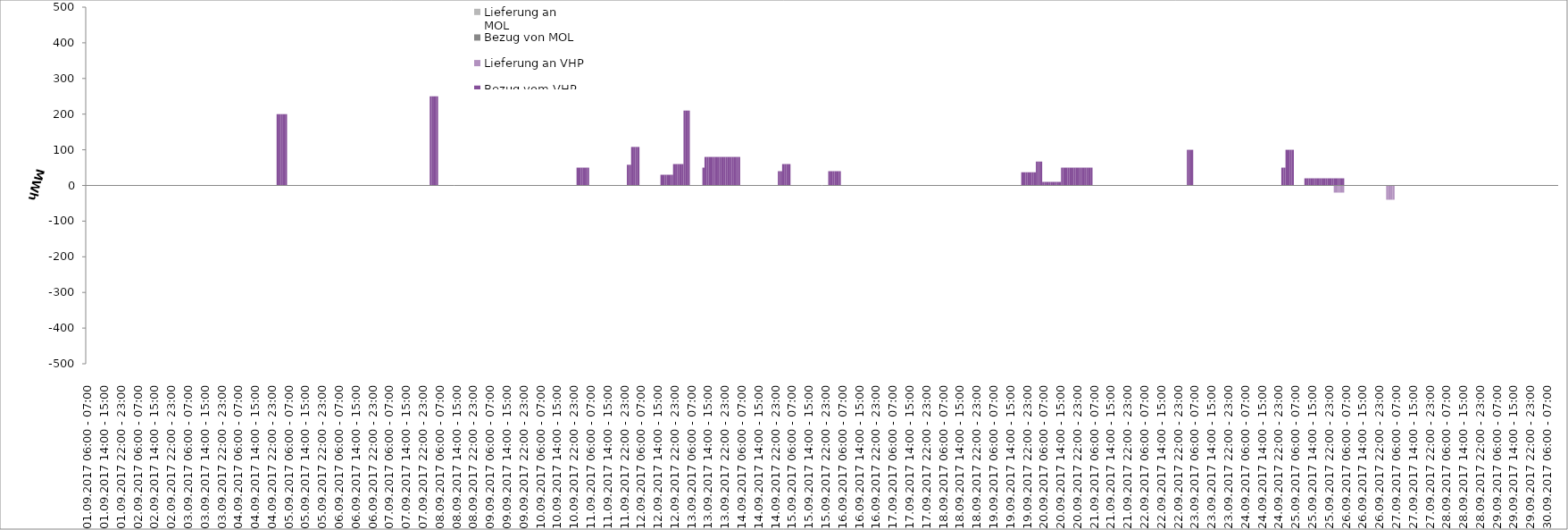
| Category | Bezug vom VHP | Lieferung an VHP | Bezug von MOL | Lieferung an MOL |
|---|---|---|---|---|
| 01.09.2017 06:00 - 07:00 | 0 | 0 | 0 | 0 |
| 01.09.2017 07:00 - 08:00 | 0 | 0 | 0 | 0 |
| 01.09.2017 08:00 - 09:00 | 0 | 0 | 0 | 0 |
| 01.09.2017 09:00 - 10:00 | 0 | 0 | 0 | 0 |
| 01.09.2017 10:00 - 11:00 | 0 | 0 | 0 | 0 |
| 01.09.2017 11:00 - 12:00 | 0 | 0 | 0 | 0 |
| 01.09.2017 12:00 - 13:00 | 0 | 0 | 0 | 0 |
| 01.09.2017 13:00 - 14:00 | 0 | 0 | 0 | 0 |
| 01.09.2017 14:00 - 15:00 | 0 | 0 | 0 | 0 |
| 01.09.2017 15:00 - 16:00 | 0 | 0 | 0 | 0 |
| 01.09.2017 16:00 - 17:00 | 0 | 0 | 0 | 0 |
| 01.09.2017 17:00 - 18:00 | 0 | 0 | 0 | 0 |
| 01.09.2017 18:00 - 19:00 | 0 | 0 | 0 | 0 |
| 01.09.2017 19:00 - 20:00 | 0 | 0 | 0 | 0 |
| 01.09.2017 20:00 - 21:00 | 0 | 0 | 0 | 0 |
| 01.09.2017 21:00 - 22:00 | 0 | 0 | 0 | 0 |
| 01.09.2017 22:00 - 23:00 | 0 | 0 | 0 | 0 |
| 01.09.2017 23:00 - 24:00 | 0 | 0 | 0 | 0 |
| 02.09.2017 00:00 - 01:00 | 0 | 0 | 0 | 0 |
| 02.09.2017 01:00 - 02:00 | 0 | 0 | 0 | 0 |
| 02.09.2017 02:00 - 03:00 | 0 | 0 | 0 | 0 |
| 02.09.2017 03:00 - 04:00 | 0 | 0 | 0 | 0 |
| 02.09.2017 04:00 - 05:00 | 0 | 0 | 0 | 0 |
| 02.09.2017 05:00 - 06:00 | 0 | 0 | 0 | 0 |
| 02.09.2017 06:00 - 07:00 | 0 | 0 | 0 | 0 |
| 02.09.2017 07:00 - 08:00 | 0 | 0 | 0 | 0 |
| 02.09.2017 08:00 - 09:00 | 0 | 0 | 0 | 0 |
| 02.09.2017 09:00 - 10:00 | 0 | 0 | 0 | 0 |
| 02.09.2017 10:00 - 11:00 | 0 | 0 | 0 | 0 |
| 02.09.2017 11:00 - 12:00 | 0 | 0 | 0 | 0 |
| 02.09.2017 12:00 - 13:00 | 0 | 0 | 0 | 0 |
| 02.09.2017 13:00 - 14:00 | 0 | 0 | 0 | 0 |
| 02.09.2017 14:00 - 15:00 | 0 | 0 | 0 | 0 |
| 02.09.2017 15:00 - 16:00 | 0 | 0 | 0 | 0 |
| 02.09.2017 16:00 - 17:00 | 0 | 0 | 0 | 0 |
| 02.09.2017 17:00 - 18:00 | 0 | 0 | 0 | 0 |
| 02.09.2017 18:00 - 19:00 | 0 | 0 | 0 | 0 |
| 02.09.2017 19:00 - 20:00 | 0 | 0 | 0 | 0 |
| 02.09.2017 20:00 - 21:00 | 0 | 0 | 0 | 0 |
| 02.09.2017 21:00 - 22:00 | 0 | 0 | 0 | 0 |
| 02.09.2017 22:00 - 23:00 | 0 | 0 | 0 | 0 |
| 02.09.2017 23:00 - 24:00 | 0 | 0 | 0 | 0 |
| 03.09.2017 00:00 - 01:00 | 0 | 0 | 0 | 0 |
| 03.09.2017 01:00 - 02:00 | 0 | 0 | 0 | 0 |
| 03.09.2017 02:00 - 03:00 | 0 | 0 | 0 | 0 |
| 03.09.2017 03:00 - 04:00 | 0 | 0 | 0 | 0 |
| 03.09.2017 04:00 - 05:00 | 0 | 0 | 0 | 0 |
| 03.09.2017 05:00 - 06:00 | 0 | 0 | 0 | 0 |
| 03.09.2017 06:00 - 07:00 | 0 | 0 | 0 | 0 |
| 03.09.2017 07:00 - 08:00 | 0 | 0 | 0 | 0 |
| 03.09.2017 08:00 - 09:00 | 0 | 0 | 0 | 0 |
| 03.09.2017 09:00 - 10:00 | 0 | 0 | 0 | 0 |
| 03.09.2017 10:00 - 11:00 | 0 | 0 | 0 | 0 |
| 03.09.2017 11:00 - 12:00 | 0 | 0 | 0 | 0 |
| 03.09.2017 12:00 - 13:00 | 0 | 0 | 0 | 0 |
| 03.09.2017 13:00 - 14:00 | 0 | 0 | 0 | 0 |
| 03.09.2017 14:00 - 15:00 | 0 | 0 | 0 | 0 |
| 03.09.2017 15:00 - 16:00 | 0 | 0 | 0 | 0 |
| 03.09.2017 16:00 - 17:00 | 0 | 0 | 0 | 0 |
| 03.09.2017 17:00 - 18:00 | 0 | 0 | 0 | 0 |
| 03.09.2017 18:00 - 19:00 | 0 | 0 | 0 | 0 |
| 03.09.2017 19:00 - 20:00 | 0 | 0 | 0 | 0 |
| 03.09.2017 20:00 - 21:00 | 0 | 0 | 0 | 0 |
| 03.09.2017 21:00 - 22:00 | 0 | 0 | 0 | 0 |
| 03.09.2017 22:00 - 23:00 | 0 | 0 | 0 | 0 |
| 03.09.2017 23:00 - 24:00 | 0 | 0 | 0 | 0 |
| 04.09.2017 00:00 - 01:00 | 0 | 0 | 0 | 0 |
| 04.09.2017 01:00 - 02:00 | 0 | 0 | 0 | 0 |
| 04.09.2017 02:00 - 03:00 | 0 | 0 | 0 | 0 |
| 04.09.2017 03:00 - 04:00 | 0 | 0 | 0 | 0 |
| 04.09.2017 04:00 - 05:00 | 0 | 0 | 0 | 0 |
| 04.09.2017 05:00 - 06:00 | 0 | 0 | 0 | 0 |
| 04.09.2017 06:00 - 07:00 | 0 | 0 | 0 | 0 |
| 04.09.2017 07:00 - 08:00 | 0 | 0 | 0 | 0 |
| 04.09.2017 08:00 - 09:00 | 0 | 0 | 0 | 0 |
| 04.09.2017 09:00 - 10:00 | 0 | 0 | 0 | 0 |
| 04.09.2017 10:00 - 11:00 | 0 | 0 | 0 | 0 |
| 04.09.2017 11:00 - 12:00 | 0 | 0 | 0 | 0 |
| 04.09.2017 12:00 - 13:00 | 0 | 0 | 0 | 0 |
| 04.09.2017 13:00 - 14:00 | 0 | 0 | 0 | 0 |
| 04.09.2017 14:00 - 15:00 | 0 | 0 | 0 | 0 |
| 04.09.2017 15:00 - 16:00 | 0 | 0 | 0 | 0 |
| 04.09.2017 16:00 - 17:00 | 0 | 0 | 0 | 0 |
| 04.09.2017 17:00 - 18:00 | 0 | 0 | 0 | 0 |
| 04.09.2017 18:00 - 19:00 | 0 | 0 | 0 | 0 |
| 04.09.2017 19:00 - 20:00 | 0 | 0 | 0 | 0 |
| 04.09.2017 20:00 - 21:00 | 0 | 0 | 0 | 0 |
| 04.09.2017 21:00 - 22:00 | 0 | 0 | 0 | 0 |
| 04.09.2017 22:00 - 23:00 | 0 | 0 | 0 | 0 |
| 04.09.2017 23:00 - 24:00 | 0 | 0 | 0 | 0 |
| 05.09.2017 00:00 - 01:00 | 0 | 0 | 0 | 0 |
| 05.09.2017 01:00 - 02:00 | 200 | 0 | 0 | 0 |
| 05.09.2017 02:00 - 03:00 | 200 | 0 | 0 | 0 |
| 05.09.2017 03:00 - 04:00 | 200 | 0 | 0 | 0 |
| 05.09.2017 04:00 - 05:00 | 200 | 0 | 0 | 0 |
| 05.09.2017 05:00 - 06:00 | 200 | 0 | 0 | 0 |
| 05.09.2017 06:00 - 07:00 | 0 | 0 | 0 | 0 |
| 05.09.2017 07:00 - 08:00 | 0 | 0 | 0 | 0 |
| 05.09.2017 08:00 - 09:00 | 0 | 0 | 0 | 0 |
| 05.09.2017 09:00 - 10:00 | 0 | 0 | 0 | 0 |
| 05.09.2017 10:00 - 11:00 | 0 | 0 | 0 | 0 |
| 05.09.2017 11:00 - 12:00 | 0 | 0 | 0 | 0 |
| 05.09.2017 12:00 - 13:00 | 0 | 0 | 0 | 0 |
| 05.09.2017 13:00 - 14:00 | 0 | 0 | 0 | 0 |
| 05.09.2017 14:00 - 15:00 | 0 | 0 | 0 | 0 |
| 05.09.2017 15:00 - 16:00 | 0 | 0 | 0 | 0 |
| 05.09.2017 16:00 - 17:00 | 0 | 0 | 0 | 0 |
| 05.09.2017 17:00 - 18:00 | 0 | 0 | 0 | 0 |
| 05.09.2017 18:00 - 19:00 | 0 | 0 | 0 | 0 |
| 05.09.2017 19:00 - 20:00 | 0 | 0 | 0 | 0 |
| 05.09.2017 20:00 - 21:00 | 0 | 0 | 0 | 0 |
| 05.09.2017 21:00 - 22:00 | 0 | 0 | 0 | 0 |
| 05.09.2017 22:00 - 23:00 | 0 | 0 | 0 | 0 |
| 05.09.2017 23:00 - 24:00 | 0 | 0 | 0 | 0 |
| 06.09.2017 00:00 - 01:00 | 0 | 0 | 0 | 0 |
| 06.09.2017 01:00 - 02:00 | 0 | 0 | 0 | 0 |
| 06.09.2017 02:00 - 03:00 | 0 | 0 | 0 | 0 |
| 06.09.2017 03:00 - 04:00 | 0 | 0 | 0 | 0 |
| 06.09.2017 04:00 - 05:00 | 0 | 0 | 0 | 0 |
| 06.09.2017 05:00 - 06:00 | 0 | 0 | 0 | 0 |
| 06.09.2017 06:00 - 07:00 | 0 | 0 | 0 | 0 |
| 06.09.2017 07:00 - 08:00 | 0 | 0 | 0 | 0 |
| 06.09.2017 08:00 - 09:00 | 0 | 0 | 0 | 0 |
| 06.09.2017 09:00 - 10:00 | 0 | 0 | 0 | 0 |
| 06.09.2017 10:00 - 11:00 | 0 | 0 | 0 | 0 |
| 06.09.2017 11:00 - 12:00 | 0 | 0 | 0 | 0 |
| 06.09.2017 12:00 - 13:00 | 0 | 0 | 0 | 0 |
| 06.09.2017 13:00 - 14:00 | 0 | 0 | 0 | 0 |
| 06.09.2017 14:00 - 15:00 | 0 | 0 | 0 | 0 |
| 06.09.2017 15:00 - 16:00 | 0 | 0 | 0 | 0 |
| 06.09.2017 16:00 - 17:00 | 0 | 0 | 0 | 0 |
| 06.09.2017 17:00 - 18:00 | 0 | 0 | 0 | 0 |
| 06.09.2017 18:00 - 19:00 | 0 | 0 | 0 | 0 |
| 06.09.2017 19:00 - 20:00 | 0 | 0 | 0 | 0 |
| 06.09.2017 20:00 - 21:00 | 0 | 0 | 0 | 0 |
| 06.09.2017 21:00 - 22:00 | 0 | 0 | 0 | 0 |
| 06.09.2017 22:00 - 23:00 | 0 | 0 | 0 | 0 |
| 06.09.2017 23:00 - 24:00 | 0 | 0 | 0 | 0 |
| 07.09.2017 00:00 - 01:00 | 0 | 0 | 0 | 0 |
| 07.09.2017 01:00 - 02:00 | 0 | 0 | 0 | 0 |
| 07.09.2017 02:00 - 03:00 | 0 | 0 | 0 | 0 |
| 07.09.2017 03:00 - 04:00 | 0 | 0 | 0 | 0 |
| 07.09.2017 04:00 - 05:00 | 0 | 0 | 0 | 0 |
| 07.09.2017 05:00 - 06:00 | 0 | 0 | 0 | 0 |
| 07.09.2017 06:00 - 07:00 | 0 | 0 | 0 | 0 |
| 07.09.2017 07:00 - 08:00 | 0 | 0 | 0 | 0 |
| 07.09.2017 08:00 - 09:00 | 0 | 0 | 0 | 0 |
| 07.09.2017 09:00 - 10:00 | 0 | 0 | 0 | 0 |
| 07.09.2017 10:00 - 11:00 | 0 | 0 | 0 | 0 |
| 07.09.2017 11:00 - 12:00 | 0 | 0 | 0 | 0 |
| 07.09.2017 12:00 - 13:00 | 0 | 0 | 0 | 0 |
| 07.09.2017 13:00 - 14:00 | 0 | 0 | 0 | 0 |
| 07.09.2017 14:00 - 15:00 | 0 | 0 | 0 | 0 |
| 07.09.2017 15:00 - 16:00 | 0 | 0 | 0 | 0 |
| 07.09.2017 16:00 - 17:00 | 0 | 0 | 0 | 0 |
| 07.09.2017 17:00 - 18:00 | 0 | 0 | 0 | 0 |
| 07.09.2017 18:00 - 19:00 | 0 | 0 | 0 | 0 |
| 07.09.2017 19:00 - 20:00 | 0 | 0 | 0 | 0 |
| 07.09.2017 20:00 - 21:00 | 0 | 0 | 0 | 0 |
| 07.09.2017 21:00 - 22:00 | 0 | 0 | 0 | 0 |
| 07.09.2017 22:00 - 23:00 | 0 | 0 | 0 | 0 |
| 07.09.2017 23:00 - 24:00 | 0 | 0 | 0 | 0 |
| 08.09.2017 00:00 - 01:00 | 0 | 0 | 0 | 0 |
| 08.09.2017 01:00 - 02:00 | 0 | 0 | 0 | 0 |
| 08.09.2017 02:00 - 03:00 | 250 | 0 | 0 | 0 |
| 08.09.2017 03:00 - 04:00 | 250 | 0 | 0 | 0 |
| 08.09.2017 04:00 - 05:00 | 250 | 0 | 0 | 0 |
| 08.09.2017 05:00 - 06:00 | 250 | 0 | 0 | 0 |
| 08.09.2017 06:00 - 07:00 | 0 | 0 | 0 | 0 |
| 08.09.2017 07:00 - 08:00 | 0 | 0 | 0 | 0 |
| 08.09.2017 08:00 - 09:00 | 0 | 0 | 0 | 0 |
| 08.09.2017 09:00 - 10:00 | 0 | 0 | 0 | 0 |
| 08.09.2017 10:00 - 11:00 | 0 | 0 | 0 | 0 |
| 08.09.2017 11:00 - 12:00 | 0 | 0 | 0 | 0 |
| 08.09.2017 12:00 - 13:00 | 0 | 0 | 0 | 0 |
| 08.09.2017 13:00 - 14:00 | 0 | 0 | 0 | 0 |
| 08.09.2017 14:00 - 15:00 | 0 | 0 | 0 | 0 |
| 08.09.2017 15:00 - 16:00 | 0 | 0 | 0 | 0 |
| 08.09.2017 16:00 - 17:00 | 0 | 0 | 0 | 0 |
| 08.09.2017 17:00 - 18:00 | 0 | 0 | 0 | 0 |
| 08.09.2017 18:00 - 19:00 | 0 | 0 | 0 | 0 |
| 08.09.2017 19:00 - 20:00 | 0 | 0 | 0 | 0 |
| 08.09.2017 20:00 - 21:00 | 0 | 0 | 0 | 0 |
| 08.09.2017 21:00 - 22:00 | 0 | 0 | 0 | 0 |
| 08.09.2017 22:00 - 23:00 | 0 | 0 | 0 | 0 |
| 08.09.2017 23:00 - 24:00 | 0 | 0 | 0 | 0 |
| 09.09.2017 00:00 - 01:00 | 0 | 0 | 0 | 0 |
| 09.09.2017 01:00 - 02:00 | 0 | 0 | 0 | 0 |
| 09.09.2017 02:00 - 03:00 | 0 | 0 | 0 | 0 |
| 09.09.2017 03:00 - 04:00 | 0 | 0 | 0 | 0 |
| 09.09.2017 04:00 - 05:00 | 0 | 0 | 0 | 0 |
| 09.09.2017 05:00 - 06:00 | 0 | 0 | 0 | 0 |
| 09.09.2017 06:00 - 07:00 | 0 | 0 | 0 | 0 |
| 09.09.2017 07:00 - 08:00 | 0 | 0 | 0 | 0 |
| 09.09.2017 08:00 - 09:00 | 0 | 0 | 0 | 0 |
| 09.09.2017 09:00 - 10:00 | 0 | 0 | 0 | 0 |
| 09.09.2017 10:00 - 11:00 | 0 | 0 | 0 | 0 |
| 09.09.2017 11:00 - 12:00 | 0 | 0 | 0 | 0 |
| 09.09.2017 12:00 - 13:00 | 0 | 0 | 0 | 0 |
| 09.09.2017 13:00 - 14:00 | 0 | 0 | 0 | 0 |
| 09.09.2017 14:00 - 15:00 | 0 | 0 | 0 | 0 |
| 09.09.2017 15:00 - 16:00 | 0 | 0 | 0 | 0 |
| 09.09.2017 16:00 - 17:00 | 0 | 0 | 0 | 0 |
| 09.09.2017 17:00 - 18:00 | 0 | 0 | 0 | 0 |
| 09.09.2017 18:00 - 19:00 | 0 | 0 | 0 | 0 |
| 09.09.2017 19:00 - 20:00 | 0 | 0 | 0 | 0 |
| 09.09.2017 20:00 - 21:00 | 0 | 0 | 0 | 0 |
| 09.09.2017 21:00 - 22:00 | 0 | 0 | 0 | 0 |
| 09.09.2017 22:00 - 23:00 | 0 | 0 | 0 | 0 |
| 09.09.2017 23:00 - 24:00 | 0 | 0 | 0 | 0 |
| 10.09.2017 00:00 - 01:00 | 0 | 0 | 0 | 0 |
| 10.09.2017 01:00 - 02:00 | 0 | 0 | 0 | 0 |
| 10.09.2017 02:00 - 03:00 | 0 | 0 | 0 | 0 |
| 10.09.2017 03:00 - 04:00 | 0 | 0 | 0 | 0 |
| 10.09.2017 04:00 - 05:00 | 0 | 0 | 0 | 0 |
| 10.09.2017 05:00 - 06:00 | 0 | 0 | 0 | 0 |
| 10.09.2017 06:00 - 07:00 | 0 | 0 | 0 | 0 |
| 10.09.2017 07:00 - 08:00 | 0 | 0 | 0 | 0 |
| 10.09.2017 08:00 - 09:00 | 0 | 0 | 0 | 0 |
| 10.09.2017 09:00 - 10:00 | 0 | 0 | 0 | 0 |
| 10.09.2017 10:00 - 11:00 | 0 | 0 | 0 | 0 |
| 10.09.2017 11:00 - 12:00 | 0 | 0 | 0 | 0 |
| 10.09.2017 12:00 - 13:00 | 0 | 0 | 0 | 0 |
| 10.09.2017 13:00 - 14:00 | 0 | 0 | 0 | 0 |
| 10.09.2017 14:00 - 15:00 | 0 | 0 | 0 | 0 |
| 10.09.2017 15:00 - 16:00 | 0 | 0 | 0 | 0 |
| 10.09.2017 16:00 - 17:00 | 0 | 0 | 0 | 0 |
| 10.09.2017 17:00 - 18:00 | 0 | 0 | 0 | 0 |
| 10.09.2017 18:00 - 19:00 | 0 | 0 | 0 | 0 |
| 10.09.2017 19:00 - 20:00 | 0 | 0 | 0 | 0 |
| 10.09.2017 20:00 - 21:00 | 0 | 0 | 0 | 0 |
| 10.09.2017 21:00 - 22:00 | 0 | 0 | 0 | 0 |
| 10.09.2017 22:00 - 23:00 | 0 | 0 | 0 | 0 |
| 10.09.2017 23:00 - 24:00 | 0 | 0 | 0 | 0 |
| 11.09.2017 00:00 - 01:00 | 50 | 0 | 0 | 0 |
| 11.09.2017 01:00 - 02:00 | 50 | 0 | 0 | 0 |
| 11.09.2017 02:00 - 03:00 | 50 | 0 | 0 | 0 |
| 11.09.2017 03:00 - 04:00 | 50 | 0 | 0 | 0 |
| 11.09.2017 04:00 - 05:00 | 50 | 0 | 0 | 0 |
| 11.09.2017 05:00 - 06:00 | 50 | 0 | 0 | 0 |
| 11.09.2017 06:00 - 07:00 | 0 | 0 | 0 | 0 |
| 11.09.2017 07:00 - 08:00 | 0 | 0 | 0 | 0 |
| 11.09.2017 08:00 - 09:00 | 0 | 0 | 0 | 0 |
| 11.09.2017 09:00 - 10:00 | 0 | 0 | 0 | 0 |
| 11.09.2017 10:00 - 11:00 | 0 | 0 | 0 | 0 |
| 11.09.2017 11:00 - 12:00 | 0 | 0 | 0 | 0 |
| 11.09.2017 12:00 - 13:00 | 0 | 0 | 0 | 0 |
| 11.09.2017 13:00 - 14:00 | 0 | 0 | 0 | 0 |
| 11.09.2017 14:00 - 15:00 | 0 | 0 | 0 | 0 |
| 11.09.2017 15:00 - 16:00 | 0 | 0 | 0 | 0 |
| 11.09.2017 16:00 - 17:00 | 0 | 0 | 0 | 0 |
| 11.09.2017 17:00 - 18:00 | 0 | 0 | 0 | 0 |
| 11.09.2017 18:00 - 19:00 | 0 | 0 | 0 | 0 |
| 11.09.2017 19:00 - 20:00 | 0 | 0 | 0 | 0 |
| 11.09.2017 20:00 - 21:00 | 0 | 0 | 0 | 0 |
| 11.09.2017 21:00 - 22:00 | 0 | 0 | 0 | 0 |
| 11.09.2017 22:00 - 23:00 | 0 | 0 | 0 | 0 |
| 11.09.2017 23:00 - 24:00 | 0 | 0 | 0 | 0 |
| 12.09.2017 00:00 - 01:00 | 58 | 0 | 0 | 0 |
| 12.09.2017 01:00 - 02:00 | 58 | 0 | 0 | 0 |
| 12.09.2017 02:00 - 03:00 | 108 | 0 | 0 | 0 |
| 12.09.2017 03:00 - 04:00 | 108 | 0 | 0 | 0 |
| 12.09.2017 04:00 - 05:00 | 108 | 0 | 0 | 0 |
| 12.09.2017 05:00 - 06:00 | 108 | 0 | 0 | 0 |
| 12.09.2017 06:00 - 07:00 | 0 | 0 | 0 | 0 |
| 12.09.2017 07:00 - 08:00 | 0 | 0 | 0 | 0 |
| 12.09.2017 08:00 - 09:00 | 0 | 0 | 0 | 0 |
| 12.09.2017 09:00 - 10:00 | 0 | 0 | 0 | 0 |
| 12.09.2017 10:00 - 11:00 | 0 | 0 | 0 | 0 |
| 12.09.2017 11:00 - 12:00 | 0 | 0 | 0 | 0 |
| 12.09.2017 12:00 - 13:00 | 0 | 0 | 0 | 0 |
| 12.09.2017 13:00 - 14:00 | 0 | 0 | 0 | 0 |
| 12.09.2017 14:00 - 15:00 | 0 | 0 | 0 | 0 |
| 12.09.2017 15:00 - 16:00 | 0 | 0 | 0 | 0 |
| 12.09.2017 16:00 - 17:00 | 30 | 0 | 0 | 0 |
| 12.09.2017 17:00 - 18:00 | 30 | 0 | 0 | 0 |
| 12.09.2017 18:00 - 19:00 | 30 | 0 | 0 | 0 |
| 12.09.2017 19:00 - 20:00 | 30 | 0 | 0 | 0 |
| 12.09.2017 20:00 - 21:00 | 30 | 0 | 0 | 0 |
| 12.09.2017 21:00 - 22:00 | 30 | 0 | 0 | 0 |
| 12.09.2017 22:00 - 23:00 | 60 | 0 | 0 | 0 |
| 12.09.2017 23:00 - 24:00 | 60 | 0 | 0 | 0 |
| 13.09.2017 00:00 - 01:00 | 60 | 0 | 0 | 0 |
| 13.09.2017 01:00 - 02:00 | 60 | 0 | 0 | 0 |
| 13.09.2017 02:00 - 03:00 | 60 | 0 | 0 | 0 |
| 13.09.2017 03:00 - 04:00 | 210 | 0 | 0 | 0 |
| 13.09.2017 04:00 - 05:00 | 210 | 0 | 0 | 0 |
| 13.09.2017 05:00 - 06:00 | 210 | 0 | 0 | 0 |
| 13.09.2017 06:00 - 07:00 | 0 | 0 | 0 | 0 |
| 13.09.2017 07:00 - 08:00 | 0 | 0 | 0 | 0 |
| 13.09.2017 08:00 - 09:00 | 0 | 0 | 0 | 0 |
| 13.09.2017 09:00 - 10:00 | 0 | 0 | 0 | 0 |
| 13.09.2017 10:00 - 11:00 | 0 | 0 | 0 | 0 |
| 13.09.2017 11:00 - 12:00 | 0 | 0 | 0 | 0 |
| 13.09.2017 12:00 - 13:00 | 50 | 0 | 0 | 0 |
| 13.09.2017 13:00 - 14:00 | 80 | 0 | 0 | 0 |
| 13.09.2017 14:00 - 15:00 | 80 | 0 | 0 | 0 |
| 13.09.2017 15:00 - 16:00 | 80 | 0 | 0 | 0 |
| 13.09.2017 16:00 - 17:00 | 80 | 0 | 0 | 0 |
| 13.09.2017 17:00 - 18:00 | 80 | 0 | 0 | 0 |
| 13.09.2017 18:00 - 19:00 | 80 | 0 | 0 | 0 |
| 13.09.2017 19:00 - 20:00 | 80 | 0 | 0 | 0 |
| 13.09.2017 20:00 - 21:00 | 80 | 0 | 0 | 0 |
| 13.09.2017 21:00 - 22:00 | 80 | 0 | 0 | 0 |
| 13.09.2017 22:00 - 23:00 | 80 | 0 | 0 | 0 |
| 13.09.2017 23:00 - 24:00 | 80 | 0 | 0 | 0 |
| 14.09.2017 00:00 - 01:00 | 80 | 0 | 0 | 0 |
| 14.09.2017 01:00 - 02:00 | 80 | 0 | 0 | 0 |
| 14.09.2017 02:00 - 03:00 | 80 | 0 | 0 | 0 |
| 14.09.2017 03:00 - 04:00 | 80 | 0 | 0 | 0 |
| 14.09.2017 04:00 - 05:00 | 80 | 0 | 0 | 0 |
| 14.09.2017 05:00 - 06:00 | 80 | 0 | 0 | 0 |
| 14.09.2017 06:00 - 07:00 | 0 | 0 | 0 | 0 |
| 14.09.2017 07:00 - 08:00 | 0 | 0 | 0 | 0 |
| 14.09.2017 08:00 - 09:00 | 0 | 0 | 0 | 0 |
| 14.09.2017 09:00 - 10:00 | 0 | 0 | 0 | 0 |
| 14.09.2017 10:00 - 11:00 | 0 | 0 | 0 | 0 |
| 14.09.2017 11:00 - 12:00 | 0 | 0 | 0 | 0 |
| 14.09.2017 12:00 - 13:00 | 0 | 0 | 0 | 0 |
| 14.09.2017 13:00 - 14:00 | 0 | 0 | 0 | 0 |
| 14.09.2017 14:00 - 15:00 | 0 | 0 | 0 | 0 |
| 14.09.2017 15:00 - 16:00 | 0 | 0 | 0 | 0 |
| 14.09.2017 16:00 - 17:00 | 0 | 0 | 0 | 0 |
| 14.09.2017 17:00 - 18:00 | 0 | 0 | 0 | 0 |
| 14.09.2017 18:00 - 19:00 | 0 | 0 | 0 | 0 |
| 14.09.2017 19:00 - 20:00 | 0 | 0 | 0 | 0 |
| 14.09.2017 20:00 - 21:00 | 0 | 0 | 0 | 0 |
| 14.09.2017 21:00 - 22:00 | 0 | 0 | 0 | 0 |
| 14.09.2017 22:00 - 23:00 | 0 | 0 | 0 | 0 |
| 14.09.2017 23:00 - 24:00 | 0 | 0 | 0 | 0 |
| 15.09.2017 00:00 - 01:00 | 40 | 0 | 0 | 0 |
| 15.09.2017 01:00 - 02:00 | 40 | 0 | 0 | 0 |
| 15.09.2017 02:00 - 03:00 | 60 | 0 | 0 | 0 |
| 15.09.2017 03:00 - 04:00 | 60 | 0 | 0 | 0 |
| 15.09.2017 04:00 - 05:00 | 60 | 0 | 0 | 0 |
| 15.09.2017 05:00 - 06:00 | 60 | 0 | 0 | 0 |
| 15.09.2017 06:00 - 07:00 | 0 | 0 | 0 | 0 |
| 15.09.2017 07:00 - 08:00 | 0 | 0 | 0 | 0 |
| 15.09.2017 08:00 - 09:00 | 0 | 0 | 0 | 0 |
| 15.09.2017 09:00 - 10:00 | 0 | 0 | 0 | 0 |
| 15.09.2017 10:00 - 11:00 | 0 | 0 | 0 | 0 |
| 15.09.2017 11:00 - 12:00 | 0 | 0 | 0 | 0 |
| 15.09.2017 12:00 - 13:00 | 0 | 0 | 0 | 0 |
| 15.09.2017 13:00 - 14:00 | 0 | 0 | 0 | 0 |
| 15.09.2017 14:00 - 15:00 | 0 | 0 | 0 | 0 |
| 15.09.2017 15:00 - 16:00 | 0 | 0 | 0 | 0 |
| 15.09.2017 16:00 - 17:00 | 0 | 0 | 0 | 0 |
| 15.09.2017 17:00 - 18:00 | 0 | 0 | 0 | 0 |
| 15.09.2017 18:00 - 19:00 | 0 | 0 | 0 | 0 |
| 15.09.2017 19:00 - 20:00 | 0 | 0 | 0 | 0 |
| 15.09.2017 20:00 - 21:00 | 0 | 0 | 0 | 0 |
| 15.09.2017 21:00 - 22:00 | 0 | 0 | 0 | 0 |
| 15.09.2017 22:00 - 23:00 | 0 | 0 | 0 | 0 |
| 15.09.2017 23:00 - 24:00 | 0 | 0 | 0 | 0 |
| 16.09.2017 00:00 - 01:00 | 40 | 0 | 0 | 0 |
| 16.09.2017 01:00 - 02:00 | 40 | 0 | 0 | 0 |
| 16.09.2017 02:00 - 03:00 | 40 | 0 | 0 | 0 |
| 16.09.2017 03:00 - 04:00 | 40 | 0 | 0 | 0 |
| 16.09.2017 04:00 - 05:00 | 40 | 0 | 0 | 0 |
| 16.09.2017 05:00 - 06:00 | 40 | 0 | 0 | 0 |
| 16.09.2017 06:00 - 07:00 | 0 | 0 | 0 | 0 |
| 16.09.2017 07:00 - 08:00 | 0 | 0 | 0 | 0 |
| 16.09.2017 08:00 - 09:00 | 0 | 0 | 0 | 0 |
| 16.09.2017 09:00 - 10:00 | 0 | 0 | 0 | 0 |
| 16.09.2017 10:00 - 11:00 | 0 | 0 | 0 | 0 |
| 16.09.2017 11:00 - 12:00 | 0 | 0 | 0 | 0 |
| 16.09.2017 12:00 - 13:00 | 0 | 0 | 0 | 0 |
| 16.09.2017 13:00 - 14:00 | 0 | 0 | 0 | 0 |
| 16.09.2017 14:00 - 15:00 | 0 | 0 | 0 | 0 |
| 16.09.2017 15:00 - 16:00 | 0 | 0 | 0 | 0 |
| 16.09.2017 16:00 - 17:00 | 0 | 0 | 0 | 0 |
| 16.09.2017 17:00 - 18:00 | 0 | 0 | 0 | 0 |
| 16.09.2017 18:00 - 19:00 | 0 | 0 | 0 | 0 |
| 16.09.2017 19:00 - 20:00 | 0 | 0 | 0 | 0 |
| 16.09.2017 20:00 - 21:00 | 0 | 0 | 0 | 0 |
| 16.09.2017 21:00 - 22:00 | 0 | 0 | 0 | 0 |
| 16.09.2017 22:00 - 23:00 | 0 | 0 | 0 | 0 |
| 16.09.2017 23:00 - 24:00 | 0 | 0 | 0 | 0 |
| 17.09.2017 00:00 - 01:00 | 0 | 0 | 0 | 0 |
| 17.09.2017 01:00 - 02:00 | 0 | 0 | 0 | 0 |
| 17.09.2017 02:00 - 03:00 | 0 | 0 | 0 | 0 |
| 17.09.2017 03:00 - 04:00 | 0 | 0 | 0 | 0 |
| 17.09.2017 04:00 - 05:00 | 0 | 0 | 0 | 0 |
| 17.09.2017 05:00 - 06:00 | 0 | 0 | 0 | 0 |
| 17.09.2017 06:00 - 07:00 | 0 | 0 | 0 | 0 |
| 17.09.2017 07:00 - 08:00 | 0 | 0 | 0 | 0 |
| 17.09.2017 08:00 - 09:00 | 0 | 0 | 0 | 0 |
| 17.09.2017 09:00 - 10:00 | 0 | 0 | 0 | 0 |
| 17.09.2017 10:00 - 11:00 | 0 | 0 | 0 | 0 |
| 17.09.2017 11:00 - 12:00 | 0 | 0 | 0 | 0 |
| 17.09.2017 12:00 - 13:00 | 0 | 0 | 0 | 0 |
| 17.09.2017 13:00 - 14:00 | 0 | 0 | 0 | 0 |
| 17.09.2017 14:00 - 15:00 | 0 | 0 | 0 | 0 |
| 17.09.2017 15:00 - 16:00 | 0 | 0 | 0 | 0 |
| 17.09.2017 16:00 - 17:00 | 0 | 0 | 0 | 0 |
| 17.09.2017 17:00 - 18:00 | 0 | 0 | 0 | 0 |
| 17.09.2017 18:00 - 19:00 | 0 | 0 | 0 | 0 |
| 17.09.2017 19:00 - 20:00 | 0 | 0 | 0 | 0 |
| 17.09.2017 20:00 - 21:00 | 0 | 0 | 0 | 0 |
| 17.09.2017 21:00 - 22:00 | 0 | 0 | 0 | 0 |
| 17.09.2017 22:00 - 23:00 | 0 | 0 | 0 | 0 |
| 17.09.2017 23:00 - 24:00 | 0 | 0 | 0 | 0 |
| 18.09.2017 00:00 - 01:00 | 0 | 0 | 0 | 0 |
| 18.09.2017 01:00 - 02:00 | 0 | 0 | 0 | 0 |
| 18.09.2017 02:00 - 03:00 | 0 | 0 | 0 | 0 |
| 18.09.2017 03:00 - 04:00 | 0 | 0 | 0 | 0 |
| 18.09.2017 04:00 - 05:00 | 0 | 0 | 0 | 0 |
| 18.09.2017 05:00 - 06:00 | 0 | 0 | 0 | 0 |
| 18.09.2017 06:00 - 07:00 | 0 | 0 | 0 | 0 |
| 18.09.2017 07:00 - 08:00 | 0 | 0 | 0 | 0 |
| 18.09.2017 08:00 - 09:00 | 0 | 0 | 0 | 0 |
| 18.09.2017 09:00 - 10:00 | 0 | 0 | 0 | 0 |
| 18.09.2017 10:00 - 11:00 | 0 | 0 | 0 | 0 |
| 18.09.2017 11:00 - 12:00 | 0 | 0 | 0 | 0 |
| 18.09.2017 12:00 - 13:00 | 0 | 0 | 0 | 0 |
| 18.09.2017 13:00 - 14:00 | 0 | 0 | 0 | 0 |
| 18.09.2017 14:00 - 15:00 | 0 | 0 | 0 | 0 |
| 18.09.2017 15:00 - 16:00 | 0 | 0 | 0 | 0 |
| 18.09.2017 16:00 - 17:00 | 0 | 0 | 0 | 0 |
| 18.09.2017 17:00 - 18:00 | 0 | 0 | 0 | 0 |
| 18.09.2017 18:00 - 19:00 | 0 | 0 | 0 | 0 |
| 18.09.2017 19:00 - 20:00 | 0 | 0 | 0 | 0 |
| 18.09.2017 20:00 - 21:00 | 0 | 0 | 0 | 0 |
| 18.09.2017 21:00 - 22:00 | 0 | 0 | 0 | 0 |
| 18.09.2017 22:00 - 23:00 | 0 | 0 | 0 | 0 |
| 18.09.2017 23:00 - 24:00 | 0 | 0 | 0 | 0 |
| 19.09.2017 00:00 - 01:00 | 0 | 0 | 0 | 0 |
| 19.09.2017 01:00 - 02:00 | 0 | 0 | 0 | 0 |
| 19.09.2017 02:00 - 03:00 | 0 | 0 | 0 | 0 |
| 19.09.2017 03:00 - 04:00 | 0 | 0 | 0 | 0 |
| 19.09.2017 04:00 - 05:00 | 0 | 0 | 0 | 0 |
| 19.09.2017 05:00 - 06:00 | 0 | 0 | 0 | 0 |
| 19.09.2017 06:00 - 07:00 | 0 | 0 | 0 | 0 |
| 19.09.2017 07:00 - 08:00 | 0 | 0 | 0 | 0 |
| 19.09.2017 08:00 - 09:00 | 0 | 0 | 0 | 0 |
| 19.09.2017 09:00 - 10:00 | 0 | 0 | 0 | 0 |
| 19.09.2017 10:00 - 11:00 | 0 | 0 | 0 | 0 |
| 19.09.2017 11:00 - 12:00 | 0 | 0 | 0 | 0 |
| 19.09.2017 12:00 - 13:00 | 0 | 0 | 0 | 0 |
| 19.09.2017 13:00 - 14:00 | 0 | 0 | 0 | 0 |
| 19.09.2017 14:00 - 15:00 | 0 | 0 | 0 | 0 |
| 19.09.2017 15:00 - 16:00 | 0 | 0 | 0 | 0 |
| 19.09.2017 16:00 - 17:00 | 0 | 0 | 0 | 0 |
| 19.09.2017 17:00 - 18:00 | 0 | 0 | 0 | 0 |
| 19.09.2017 18:00 - 19:00 | 0 | 0 | 0 | 0 |
| 19.09.2017 19:00 - 20:00 | 0 | 0 | 0 | 0 |
| 19.09.2017 20:00 - 21:00 | 37 | 0 | 0 | 0 |
| 19.09.2017 21:00 - 22:00 | 37 | 0 | 0 | 0 |
| 19.09.2017 22:00 - 23:00 | 37 | 0 | 0 | 0 |
| 19.09.2017 23:00 - 24:00 | 37 | 0 | 0 | 0 |
| 20.09.2017 00:00 - 01:00 | 37 | 0 | 0 | 0 |
| 20.09.2017 01:00 - 02:00 | 37 | 0 | 0 | 0 |
| 20.09.2017 02:00 - 03:00 | 37 | 0 | 0 | 0 |
| 20.09.2017 03:00 - 04:00 | 67 | 0 | 0 | 0 |
| 20.09.2017 04:00 - 05:00 | 67 | 0 | 0 | 0 |
| 20.09.2017 05:00 - 06:00 | 67 | 0 | 0 | 0 |
| 20.09.2017 06:00 - 07:00 | 10 | 0 | 0 | 0 |
| 20.09.2017 07:00 - 08:00 | 10 | 0 | 0 | 0 |
| 20.09.2017 08:00 - 09:00 | 10 | 0 | 0 | 0 |
| 20.09.2017 09:00 - 10:00 | 10 | 0 | 0 | 0 |
| 20.09.2017 10:00 - 11:00 | 10 | 0 | 0 | 0 |
| 20.09.2017 11:00 - 12:00 | 10 | 0 | 0 | 0 |
| 20.09.2017 12:00 - 13:00 | 10 | 0 | 0 | 0 |
| 20.09.2017 13:00 - 14:00 | 10 | 0 | 0 | 0 |
| 20.09.2017 14:00 - 15:00 | 10 | 0 | 0 | 0 |
| 20.09.2017 15:00 - 16:00 | 50 | 0 | 0 | 0 |
| 20.09.2017 16:00 - 17:00 | 50 | 0 | 0 | 0 |
| 20.09.2017 17:00 - 18:00 | 50 | 0 | 0 | 0 |
| 20.09.2017 18:00 - 19:00 | 50 | 0 | 0 | 0 |
| 20.09.2017 19:00 - 20:00 | 50 | 0 | 0 | 0 |
| 20.09.2017 20:00 - 21:00 | 50 | 0 | 0 | 0 |
| 20.09.2017 21:00 - 22:00 | 50 | 0 | 0 | 0 |
| 20.09.2017 22:00 - 23:00 | 50 | 0 | 0 | 0 |
| 20.09.2017 23:00 - 24:00 | 50 | 0 | 0 | 0 |
| 21.09.2017 00:00 - 01:00 | 50 | 0 | 0 | 0 |
| 21.09.2017 01:00 - 02:00 | 50 | 0 | 0 | 0 |
| 21.09.2017 02:00 - 03:00 | 50 | 0 | 0 | 0 |
| 21.09.2017 03:00 - 04:00 | 50 | 0 | 0 | 0 |
| 21.09.2017 04:00 - 05:00 | 50 | 0 | 0 | 0 |
| 21.09.2017 05:00 - 06:00 | 50 | 0 | 0 | 0 |
| 21.09.2017 06:00 - 07:00 | 0 | 0 | 0 | 0 |
| 21.09.2017 07:00 - 08:00 | 0 | 0 | 0 | 0 |
| 21.09.2017 08:00 - 09:00 | 0 | 0 | 0 | 0 |
| 21.09.2017 09:00 - 10:00 | 0 | 0 | 0 | 0 |
| 21.09.2017 10:00 - 11:00 | 0 | 0 | 0 | 0 |
| 21.09.2017 11:00 - 12:00 | 0 | 0 | 0 | 0 |
| 21.09.2017 12:00 - 13:00 | 0 | 0 | 0 | 0 |
| 21.09.2017 13:00 - 14:00 | 0 | 0 | 0 | 0 |
| 21.09.2017 14:00 - 15:00 | 0 | 0 | 0 | 0 |
| 21.09.2017 15:00 - 16:00 | 0 | 0 | 0 | 0 |
| 21.09.2017 16:00 - 17:00 | 0 | 0 | 0 | 0 |
| 21.09.2017 17:00 - 18:00 | 0 | 0 | 0 | 0 |
| 21.09.2017 18:00 - 19:00 | 0 | 0 | 0 | 0 |
| 21.09.2017 19:00 - 20:00 | 0 | 0 | 0 | 0 |
| 21.09.2017 20:00 - 21:00 | 0 | 0 | 0 | 0 |
| 21.09.2017 21:00 - 22:00 | 0 | 0 | 0 | 0 |
| 21.09.2017 22:00 - 23:00 | 0 | 0 | 0 | 0 |
| 21.09.2017 23:00 - 24:00 | 0 | 0 | 0 | 0 |
| 22.09.2017 00:00 - 01:00 | 0 | 0 | 0 | 0 |
| 22.09.2017 01:00 - 02:00 | 0 | 0 | 0 | 0 |
| 22.09.2017 02:00 - 03:00 | 0 | 0 | 0 | 0 |
| 22.09.2017 03:00 - 04:00 | 0 | 0 | 0 | 0 |
| 22.09.2017 04:00 - 05:00 | 0 | 0 | 0 | 0 |
| 22.09.2017 05:00 - 06:00 | 0 | 0 | 0 | 0 |
| 22.09.2017 06:00 - 07:00 | 0 | 0 | 0 | 0 |
| 22.09.2017 07:00 - 08:00 | 0 | 0 | 0 | 0 |
| 22.09.2017 08:00 - 09:00 | 0 | 0 | 0 | 0 |
| 22.09.2017 09:00 - 10:00 | 0 | 0 | 0 | 0 |
| 22.09.2017 10:00 - 11:00 | 0 | 0 | 0 | 0 |
| 22.09.2017 11:00 - 12:00 | 0 | 0 | 0 | 0 |
| 22.09.2017 12:00 - 13:00 | 0 | 0 | 0 | 0 |
| 22.09.2017 13:00 - 14:00 | 0 | 0 | 0 | 0 |
| 22.09.2017 14:00 - 15:00 | 0 | 0 | 0 | 0 |
| 22.09.2017 15:00 - 16:00 | 0 | 0 | 0 | 0 |
| 22.09.2017 16:00 - 17:00 | 0 | 0 | 0 | 0 |
| 22.09.2017 17:00 - 18:00 | 0 | 0 | 0 | 0 |
| 22.09.2017 18:00 - 19:00 | 0 | 0 | 0 | 0 |
| 22.09.2017 19:00 - 20:00 | 0 | 0 | 0 | 0 |
| 22.09.2017 20:00 - 21:00 | 0 | 0 | 0 | 0 |
| 22.09.2017 21:00 - 22:00 | 0 | 0 | 0 | 0 |
| 22.09.2017 22:00 - 23:00 | 0 | 0 | 0 | 0 |
| 22.09.2017 23:00 - 24:00 | 0 | 0 | 0 | 0 |
| 23.09.2017 00:00 - 01:00 | 0 | 0 | 0 | 0 |
| 23.09.2017 01:00 - 02:00 | 0 | 0 | 0 | 0 |
| 23.09.2017 02:00 - 03:00 | 0 | 0 | 0 | 0 |
| 23.09.2017 03:00 - 04:00 | 100 | 0 | 0 | 0 |
| 23.09.2017 04:00 - 05:00 | 100 | 0 | 0 | 0 |
| 23.09.2017 05:00 - 06:00 | 100 | 0 | 0 | 0 |
| 23.09.2017 06:00 - 07:00 | 0 | 0 | 0 | 0 |
| 23.09.2017 07:00 - 08:00 | 0 | 0 | 0 | 0 |
| 23.09.2017 08:00 - 09:00 | 0 | 0 | 0 | 0 |
| 23.09.2017 09:00 - 10:00 | 0 | 0 | 0 | 0 |
| 23.09.2017 10:00 - 11:00 | 0 | 0 | 0 | 0 |
| 23.09.2017 11:00 - 12:00 | 0 | 0 | 0 | 0 |
| 23.09.2017 12:00 - 13:00 | 0 | 0 | 0 | 0 |
| 23.09.2017 13:00 - 14:00 | 0 | 0 | 0 | 0 |
| 23.09.2017 14:00 - 15:00 | 0 | 0 | 0 | 0 |
| 23.09.2017 15:00 - 16:00 | 0 | 0 | 0 | 0 |
| 23.09.2017 16:00 - 17:00 | 0 | 0 | 0 | 0 |
| 23.09.2017 17:00 - 18:00 | 0 | 0 | 0 | 0 |
| 23.09.2017 18:00 - 19:00 | 0 | 0 | 0 | 0 |
| 23.09.2017 19:00 - 20:00 | 0 | 0 | 0 | 0 |
| 23.09.2017 20:00 - 21:00 | 0 | 0 | 0 | 0 |
| 23.09.2017 21:00 - 22:00 | 0 | 0 | 0 | 0 |
| 23.09.2017 22:00 - 23:00 | 0 | 0 | 0 | 0 |
| 23.09.2017 23:00 - 24:00 | 0 | 0 | 0 | 0 |
| 24.09.2017 00:00 - 01:00 | 0 | 0 | 0 | 0 |
| 24.09.2017 01:00 - 02:00 | 0 | 0 | 0 | 0 |
| 24.09.2017 02:00 - 03:00 | 0 | 0 | 0 | 0 |
| 24.09.2017 03:00 - 04:00 | 0 | 0 | 0 | 0 |
| 24.09.2017 04:00 - 05:00 | 0 | 0 | 0 | 0 |
| 24.09.2017 05:00 - 06:00 | 0 | 0 | 0 | 0 |
| 24.09.2017 06:00 - 07:00 | 0 | 0 | 0 | 0 |
| 24.09.2017 07:00 - 08:00 | 0 | 0 | 0 | 0 |
| 24.09.2017 08:00 - 09:00 | 0 | 0 | 0 | 0 |
| 24.09.2017 09:00 - 10:00 | 0 | 0 | 0 | 0 |
| 24.09.2017 10:00 - 11:00 | 0 | 0 | 0 | 0 |
| 24.09.2017 11:00 - 12:00 | 0 | 0 | 0 | 0 |
| 24.09.2017 12:00 - 13:00 | 0 | 0 | 0 | 0 |
| 24.09.2017 13:00 - 14:00 | 0 | 0 | 0 | 0 |
| 24.09.2017 14:00 - 15:00 | 0 | 0 | 0 | 0 |
| 24.09.2017 15:00 - 16:00 | 0 | 0 | 0 | 0 |
| 24.09.2017 16:00 - 17:00 | 0 | 0 | 0 | 0 |
| 24.09.2017 17:00 - 18:00 | 0 | 0 | 0 | 0 |
| 24.09.2017 18:00 - 19:00 | 0 | 0 | 0 | 0 |
| 24.09.2017 19:00 - 20:00 | 0 | 0 | 0 | 0 |
| 24.09.2017 20:00 - 21:00 | 0 | 0 | 0 | 0 |
| 24.09.2017 21:00 - 22:00 | 0 | 0 | 0 | 0 |
| 24.09.2017 22:00 - 23:00 | 0 | 0 | 0 | 0 |
| 24.09.2017 23:00 - 24:00 | 0 | 0 | 0 | 0 |
| 25.09.2017 00:00 - 01:00 | 50 | 0 | 0 | 0 |
| 25.09.2017 01:00 - 02:00 | 50 | 0 | 0 | 0 |
| 25.09.2017 02:00 - 03:00 | 100 | 0 | 0 | 0 |
| 25.09.2017 03:00 - 04:00 | 100 | 0 | 0 | 0 |
| 25.09.2017 04:00 - 05:00 | 100 | 0 | 0 | 0 |
| 25.09.2017 05:00 - 06:00 | 100 | 0 | 0 | 0 |
| 25.09.2017 06:00 - 07:00 | 0 | 0 | 0 | 0 |
| 25.09.2017 07:00 - 08:00 | 0 | 0 | 0 | 0 |
| 25.09.2017 08:00 - 09:00 | 0 | 0 | 0 | 0 |
| 25.09.2017 09:00 - 10:00 | 0 | 0 | 0 | 0 |
| 25.09.2017 10:00 - 11:00 | 0 | 0 | 0 | 0 |
| 25.09.2017 11:00 - 12:00 | 20 | 0 | 0 | 0 |
| 25.09.2017 12:00 - 13:00 | 20 | 0 | 0 | 0 |
| 25.09.2017 13:00 - 14:00 | 20 | 0 | 0 | 0 |
| 25.09.2017 14:00 - 15:00 | 20 | 0 | 0 | 0 |
| 25.09.2017 15:00 - 16:00 | 20 | 0 | 0 | 0 |
| 25.09.2017 16:00 - 17:00 | 20 | 0 | 0 | 0 |
| 25.09.2017 17:00 - 18:00 | 20 | 0 | 0 | 0 |
| 25.09.2017 18:00 - 19:00 | 20 | 0 | 0 | 0 |
| 25.09.2017 19:00 - 20:00 | 20 | 0 | 0 | 0 |
| 25.09.2017 20:00 - 21:00 | 20 | 0 | 0 | 0 |
| 25.09.2017 21:00 - 22:00 | 20 | 0 | 0 | 0 |
| 25.09.2017 22:00 - 23:00 | 20 | 0 | 0 | 0 |
| 25.09.2017 23:00 - 24:00 | 20 | 0 | 0 | 0 |
| 26.09.2017 00:00 - 01:00 | 20 | 0 | 0 | 0 |
| 26.09.2017 01:00 - 02:00 | 20 | -20 | 0 | 0 |
| 26.09.2017 02:00 - 03:00 | 20 | -20 | 0 | 0 |
| 26.09.2017 03:00 - 04:00 | 20 | -20 | 0 | 0 |
| 26.09.2017 04:00 - 05:00 | 20 | -20 | 0 | 0 |
| 26.09.2017 05:00 - 06:00 | 20 | -20 | 0 | 0 |
| 26.09.2017 06:00 - 07:00 | 0 | 0 | 0 | 0 |
| 26.09.2017 07:00 - 08:00 | 0 | 0 | 0 | 0 |
| 26.09.2017 08:00 - 09:00 | 0 | 0 | 0 | 0 |
| 26.09.2017 09:00 - 10:00 | 0 | 0 | 0 | 0 |
| 26.09.2017 10:00 - 11:00 | 0 | 0 | 0 | 0 |
| 26.09.2017 11:00 - 12:00 | 0 | 0 | 0 | 0 |
| 26.09.2017 12:00 - 13:00 | 0 | 0 | 0 | 0 |
| 26.09.2017 13:00 - 14:00 | 0 | 0 | 0 | 0 |
| 26.09.2017 14:00 - 15:00 | 0 | 0 | 0 | 0 |
| 26.09.2017 15:00 - 16:00 | 0 | 0 | 0 | 0 |
| 26.09.2017 16:00 - 17:00 | 0 | 0 | 0 | 0 |
| 26.09.2017 17:00 - 18:00 | 0 | 0 | 0 | 0 |
| 26.09.2017 18:00 - 19:00 | 0 | 0 | 0 | 0 |
| 26.09.2017 19:00 - 20:00 | 0 | 0 | 0 | 0 |
| 26.09.2017 20:00 - 21:00 | 0 | 0 | 0 | 0 |
| 26.09.2017 21:00 - 22:00 | 0 | 0 | 0 | 0 |
| 26.09.2017 22:00 - 23:00 | 0 | 0 | 0 | 0 |
| 26.09.2017 23:00 - 24:00 | 0 | 0 | 0 | 0 |
| 27.09.2017 00:00 - 01:00 | 0 | 0 | 0 | 0 |
| 27.09.2017 01:00 - 02:00 | 0 | 0 | 0 | 0 |
| 27.09.2017 02:00 - 03:00 | 0 | -40 | 0 | 0 |
| 27.09.2017 03:00 - 04:00 | 0 | -40 | 0 | 0 |
| 27.09.2017 04:00 - 05:00 | 0 | -40 | 0 | 0 |
| 27.09.2017 05:00 - 06:00 | 0 | -40 | 0 | 0 |
| 27.09.2017 06:00 - 07:00 | 0 | 0 | 0 | 0 |
| 27.09.2017 07:00 - 08:00 | 0 | 0 | 0 | 0 |
| 27.09.2017 08:00 - 09:00 | 0 | 0 | 0 | 0 |
| 27.09.2017 09:00 - 10:00 | 0 | 0 | 0 | 0 |
| 27.09.2017 10:00 - 11:00 | 0 | 0 | 0 | 0 |
| 27.09.2017 11:00 - 12:00 | 0 | 0 | 0 | 0 |
| 27.09.2017 12:00 - 13:00 | 0 | 0 | 0 | 0 |
| 27.09.2017 13:00 - 14:00 | 0 | 0 | 0 | 0 |
| 27.09.2017 14:00 - 15:00 | 0 | 0 | 0 | 0 |
| 27.09.2017 15:00 - 16:00 | 0 | 0 | 0 | 0 |
| 27.09.2017 16:00 - 17:00 | 0 | 0 | 0 | 0 |
| 27.09.2017 17:00 - 18:00 | 0 | 0 | 0 | 0 |
| 27.09.2017 18:00 - 19:00 | 0 | 0 | 0 | 0 |
| 27.09.2017 19:00 - 20:00 | 0 | 0 | 0 | 0 |
| 27.09.2017 20:00 - 21:00 | 0 | 0 | 0 | 0 |
| 27.09.2017 21:00 - 22:00 | 0 | 0 | 0 | 0 |
| 27.09.2017 22:00 - 23:00 | 0 | 0 | 0 | 0 |
| 27.09.2017 23:00 - 24:00 | 0 | 0 | 0 | 0 |
| 28.09.2017 00:00 - 01:00 | 0 | 0 | 0 | 0 |
| 28.09.2017 01:00 - 02:00 | 0 | 0 | 0 | 0 |
| 28.09.2017 02:00 - 03:00 | 0 | 0 | 0 | 0 |
| 28.09.2017 03:00 - 04:00 | 0 | 0 | 0 | 0 |
| 28.09.2017 04:00 - 05:00 | 0 | 0 | 0 | 0 |
| 28.09.2017 05:00 - 06:00 | 0 | 0 | 0 | 0 |
| 28.09.2017 06:00 - 07:00 | 0 | 0 | 0 | 0 |
| 28.09.2017 07:00 - 08:00 | 0 | 0 | 0 | 0 |
| 28.09.2017 08:00 - 09:00 | 0 | 0 | 0 | 0 |
| 28.09.2017 09:00 - 10:00 | 0 | 0 | 0 | 0 |
| 28.09.2017 10:00 - 11:00 | 0 | 0 | 0 | 0 |
| 28.09.2017 11:00 - 12:00 | 0 | 0 | 0 | 0 |
| 28.09.2017 12:00 - 13:00 | 0 | 0 | 0 | 0 |
| 28.09.2017 13:00 - 14:00 | 0 | 0 | 0 | 0 |
| 28.09.2017 14:00 - 15:00 | 0 | 0 | 0 | 0 |
| 28.09.2017 15:00 - 16:00 | 0 | 0 | 0 | 0 |
| 28.09.2017 16:00 - 17:00 | 0 | 0 | 0 | 0 |
| 28.09.2017 17:00 - 18:00 | 0 | 0 | 0 | 0 |
| 28.09.2017 18:00 - 19:00 | 0 | 0 | 0 | 0 |
| 28.09.2017 19:00 - 20:00 | 0 | 0 | 0 | 0 |
| 28.09.2017 20:00 - 21:00 | 0 | 0 | 0 | 0 |
| 28.09.2017 21:00 - 22:00 | 0 | 0 | 0 | 0 |
| 28.09.2017 22:00 - 23:00 | 0 | 0 | 0 | 0 |
| 28.09.2017 23:00 - 24:00 | 0 | 0 | 0 | 0 |
| 29.09.2017 00:00 - 01:00 | 0 | 0 | 0 | 0 |
| 29.09.2017 01:00 - 02:00 | 0 | 0 | 0 | 0 |
| 29.09.2017 02:00 - 03:00 | 0 | 0 | 0 | 0 |
| 29.09.2017 03:00 - 04:00 | 0 | 0 | 0 | 0 |
| 29.09.2017 04:00 - 05:00 | 0 | 0 | 0 | 0 |
| 29.09.2017 05:00 - 06:00 | 0 | 0 | 0 | 0 |
| 29.09.2017 06:00 - 07:00 | 0 | 0 | 0 | 0 |
| 29.09.2017 07:00 - 08:00 | 0 | 0 | 0 | 0 |
| 29.09.2017 08:00 - 09:00 | 0 | 0 | 0 | 0 |
| 29.09.2017 09:00 - 10:00 | 0 | 0 | 0 | 0 |
| 29.09.2017 10:00 - 11:00 | 0 | 0 | 0 | 0 |
| 29.09.2017 11:00 - 12:00 | 0 | 0 | 0 | 0 |
| 29.09.2017 12:00 - 13:00 | 0 | 0 | 0 | 0 |
| 29.09.2017 13:00 - 14:00 | 0 | 0 | 0 | 0 |
| 29.09.2017 14:00 - 15:00 | 0 | 0 | 0 | 0 |
| 29.09.2017 15:00 - 16:00 | 0 | 0 | 0 | 0 |
| 29.09.2017 16:00 - 17:00 | 0 | 0 | 0 | 0 |
| 29.09.2017 17:00 - 18:00 | 0 | 0 | 0 | 0 |
| 29.09.2017 18:00 - 19:00 | 0 | 0 | 0 | 0 |
| 29.09.2017 19:00 - 20:00 | 0 | 0 | 0 | 0 |
| 29.09.2017 20:00 - 21:00 | 0 | 0 | 0 | 0 |
| 29.09.2017 21:00 - 22:00 | 0 | 0 | 0 | 0 |
| 29.09.2017 22:00 - 23:00 | 0 | 0 | 0 | 0 |
| 29.09.2017 23:00 - 24:00 | 0 | 0 | 0 | 0 |
| 30.09.2017 00:00 - 01:00 | 0 | 0 | 0 | 0 |
| 30.09.2017 01:00 - 02:00 | 0 | 0 | 0 | 0 |
| 30.09.2017 02:00 - 03:00 | 0 | 0 | 0 | 0 |
| 30.09.2017 03:00 - 04:00 | 0 | 0 | 0 | 0 |
| 30.09.2017 04:00 - 05:00 | 0 | 0 | 0 | 0 |
| 30.09.2017 05:00 - 06:00 | 0 | 0 | 0 | 0 |
| 30.09.2017 06:00 - 07:00 | 0 | 0 | 0 | 0 |
| 30.09.2017 07:00 - 08:00 | 0 | 0 | 0 | 0 |
| 30.09.2017 08:00 - 09:00 | 0 | 0 | 0 | 0 |
| 30.09.2017 09:00 - 10:00 | 0 | 0 | 0 | 0 |
| 30.09.2017 10:00 - 11:00 | 0 | 0 | 0 | 0 |
| 30.09.2017 11:00 - 12:00 | 0 | 0 | 0 | 0 |